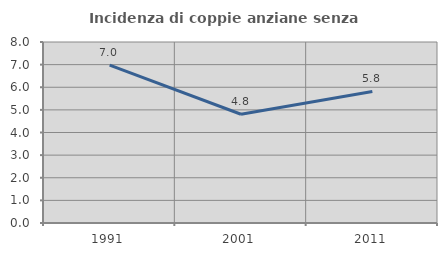
| Category | Incidenza di coppie anziane senza figli  |
|---|---|
| 1991.0 | 6.977 |
| 2001.0 | 4.808 |
| 2011.0 | 5.814 |